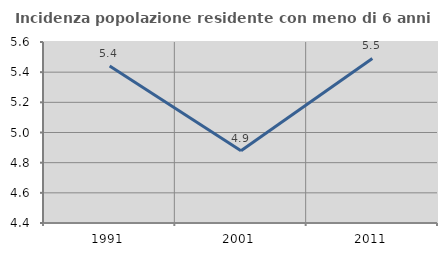
| Category | Incidenza popolazione residente con meno di 6 anni |
|---|---|
| 1991.0 | 5.441 |
| 2001.0 | 4.879 |
| 2011.0 | 5.491 |